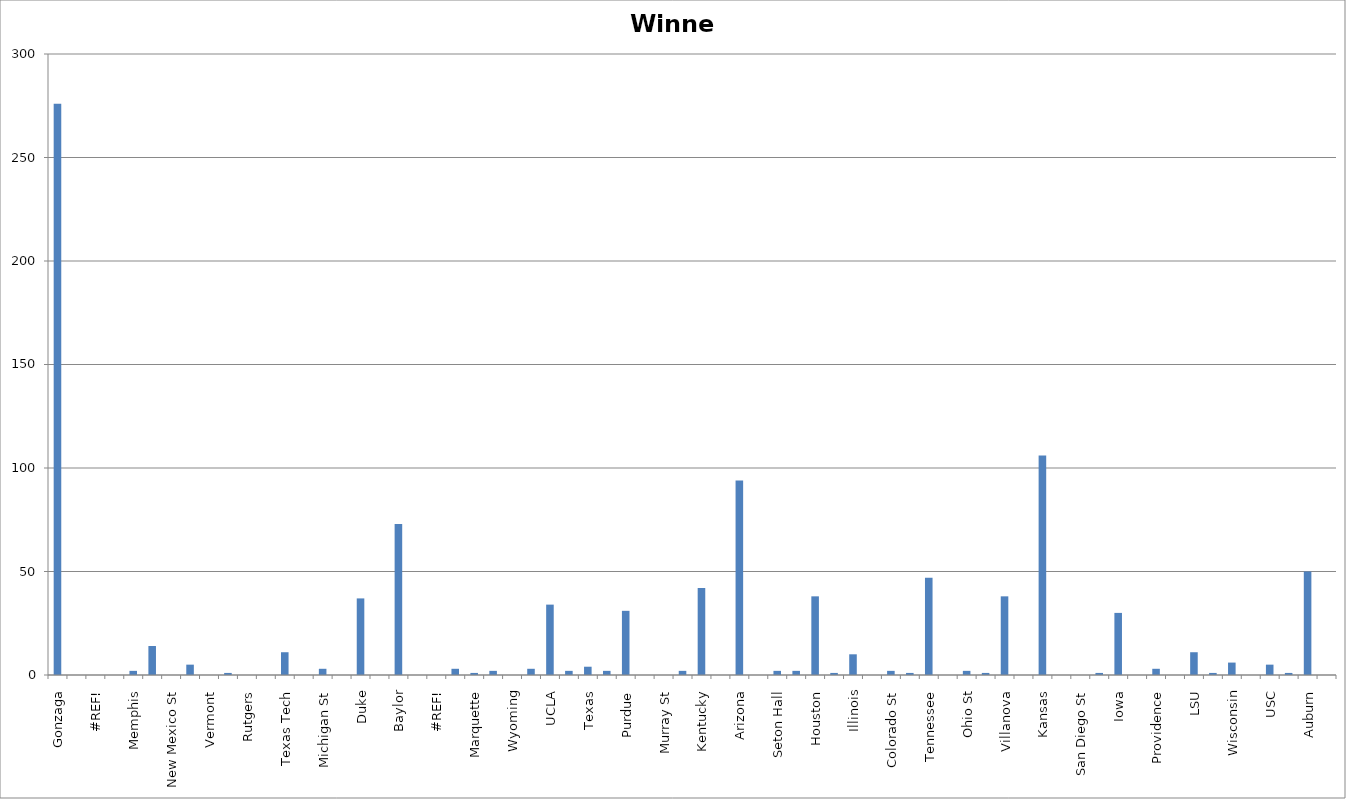
| Category | Winner |
|---|---|
| Gonzaga | 276 |
| Georgia St | 0 |
| #REF! | 0 |
| Boise St | 0 |
| Memphis | 2 |
| Connecticut | 14 |
| New Mexico St | 0 |
| Arkansas | 5 |
| Vermont | 0 |
| Alabama | 1 |
| Rutgers | 0 |
| Notre Dame | 0 |
| Texas Tech | 11 |
| Montana St | 0 |
| Michigan St | 3 |
| Davidson | 0 |
| Duke | 37 |
| CS Fullerton | 0 |
| Baylor | 73 |
| Norfolk St | 0 |
| #REF! | 0 |
| North Carolina | 3 |
| Marquette | 1 |
| Saint Mary's | 2 |
| Wyoming | 0 |
| Indiana | 3 |
| UCLA | 34 |
| Akron | 2 |
| Texas | 4 |
| Virgina Tech | 2 |
| Purdue | 31 |
| Yale | 0 |
| Murray St | 0 |
| San Francisco | 2 |
| Kentucky | 42 |
| St. Peter's | 0 |
| Arizona | 94 |
| Wright St | 0 |
| Seton Hall | 2 |
| TCU | 2 |
| Houston | 38 |
| UAB | 1 |
| Illinois | 10 |
| Chattanooga | 0 |
| Colorado St | 2 |
| Michigan | 1 |
| Tennessee | 47 |
| Longwood | 0 |
| Ohio St | 2 |
| Loyola Chicago | 1 |
| Villanova | 38 |
| Delaware | 0 |
| Kansas | 106 |
| Texas Southern | 0 |
| San Diego St | 0 |
| Creighton | 1 |
| Iowa | 30 |
| Richmond | 0 |
| Providence | 3 |
| South Dakota St | 0 |
| LSU | 11 |
| Iowa St | 1 |
| Wisconsin | 6 |
| Colgate | 0 |
| USC | 5 |
| Miami Florida | 1 |
| Auburn | 50 |
| Jacksonville St | 0 |